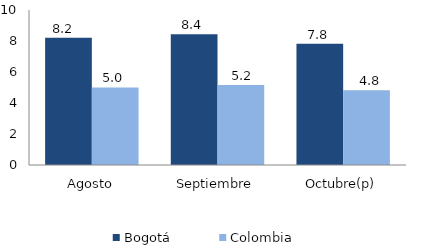
| Category | Bogotá | Colombia |
|---|---|---|
| Agosto | 8.216 | 5.004 |
| Septiembre | 8.441 | 5.16 |
| Octubre(p) | 7.826 | 4.817 |